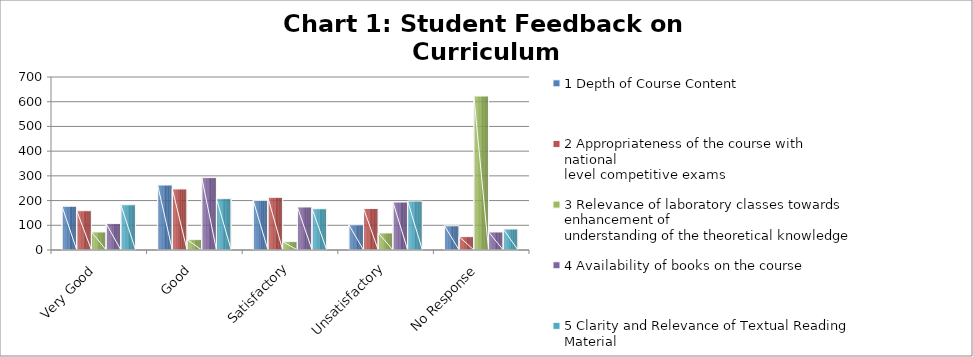
| Category | 1 Depth of Course Content | 2 Appropriateness of the course with national 
level competitive exams | 3 Relevance of laboratory classes towards enhancement of
understanding of the theoretical knowledge | 4 Availability of books on the course | 5 Clarity and Relevance of Textual Reading Material |
|---|---|---|---|---|---|
| Very Good | 177 | 159 | 73 | 107 | 183 |
| Good | 263 | 247 | 42 | 293 | 208 |
| Satisfactory | 201 | 213 | 34 | 174 | 167 |
| Unsatisfactory | 102 | 168 | 69 | 194 | 198 |
| No Response | 98 | 54 | 623 | 73 | 85 |